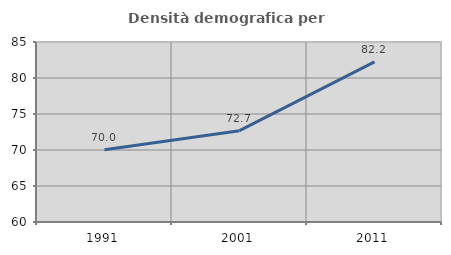
| Category | Densità demografica |
|---|---|
| 1991.0 | 70.048 |
| 2001.0 | 72.687 |
| 2011.0 | 82.23 |